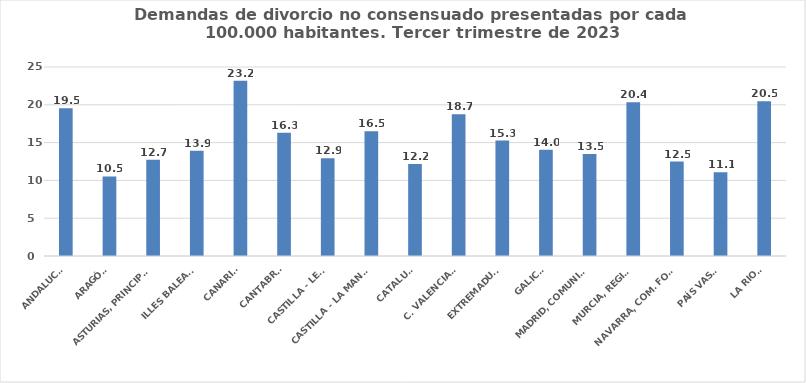
| Category | Series 0 |
|---|---|
| ANDALUCÍA | 19.531 |
| ARAGÓN | 10.524 |
| ASTURIAS, PRINCIPADO | 12.716 |
| ILLES BALEARS | 13.922 |
| CANARIAS | 23.182 |
| CANTABRIA | 16.312 |
| CASTILLA - LEÓN | 12.927 |
| CASTILLA - LA MANCHA | 16.485 |
| CATALUÑA | 12.179 |
| C. VALENCIANA | 18.742 |
| EXTREMADURA | 15.271 |
| GALICIA | 14.039 |
| MADRID, COMUNIDAD | 13.491 |
| MURCIA, REGIÓN | 20.352 |
| NAVARRA, COM. FORAL | 12.496 |
| PAÍS VASCO | 11.082 |
| LA RIOJA | 20.48 |